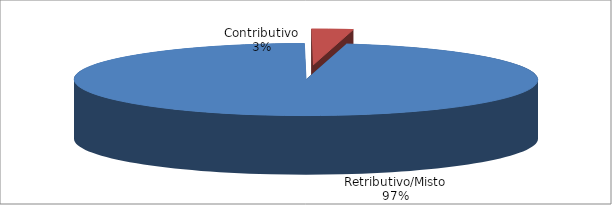
| Category | Series 1 |
|---|---|
| Retributivo/Misto | 55108 |
| Contributivo | 1641 |